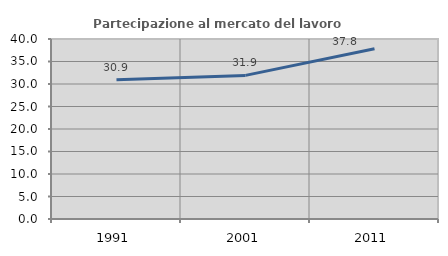
| Category | Partecipazione al mercato del lavoro  femminile |
|---|---|
| 1991.0 | 30.935 |
| 2001.0 | 31.916 |
| 2011.0 | 37.828 |